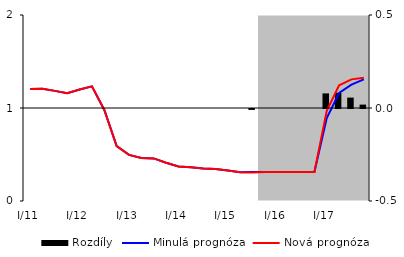
| Category | Rozdíly |
|---|---|
| 0 | 0 |
| 1 | 0 |
| 2 | 0 |
| 3 | 0 |
| 4 | 0 |
| 5 | 0 |
| 6 | 0 |
| 7 | 0 |
| 8 | 0 |
| 9 | 0 |
| 10 | 0 |
| 11 | 0 |
| 12 | 0 |
| 13 | 0 |
| 14 | 0 |
| 15 | 0 |
| 16 | 0 |
| 17 | 0 |
| 18 | -0.005 |
| 19 | 0 |
| 20 | 0 |
| 21 | 0 |
| 22 | 0 |
| 23 | 0 |
| 24 | 0.078 |
| 25 | 0.082 |
| 26 | 0.056 |
| 27 | 0.018 |